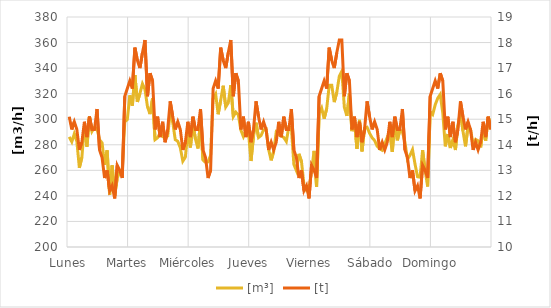
| Category | [m³] |
|---|---|
| Lunes | 286.2 |
| Lunes | 282.3 |
| Lunes | 288.6 |
| Lunes | 282.7 |
| Lunes | 262 |
| Lunes | 270.2 |
| Lunes | 294.7 |
| Lunes | 278.5 |
| Lunes | 302.2 |
| Lunes | 290.5 |
| Lunes | 293.8 |
| Lunes | 292.6 |
| Lunes | 283.9 |
| Lunes | 281.5 |
| Lunes | 264.4 |
| Lunes | 275.6 |
| Lunes | 241 |
| Lunes | 263.9 |
| Lunes | 240.3 |
| Lunes | 253.8 |
| Lunes | 258.5 |
| Lunes | 260.2 |
| Lunes | 298 |
| Lunes | 299.8 |
| Martes | 318.7 |
| Martes | 310.6 |
| Martes | 334.5 |
| Martes | 313.5 |
| Martes | 320.2 |
| Martes | 327.7 |
| Martes | 323.3 |
| Martes | 309.7 |
| Martes | 304 |
| Martes | 316.2 |
| Martes | 284 |
| Martes | 285.5 |
| Martes | 289.1 |
| Martes | 286.5 |
| Martes | 285.1 |
| Martes | 286.9 |
| Martes | 305.5 |
| Martes | 297.6 |
| Martes | 284 |
| Martes | 282.7 |
| Martes | 277.7 |
| Martes | 267.2 |
| Martes | 270.3 |
| Martes | 291.5 |
| Miércoles | 277.9 |
| Miércoles | 296.2 |
| Miércoles | 284.5 |
| Miércoles | 277.1 |
| Miércoles | 298.4 |
| Miércoles | 268.1 |
| Miércoles | 266.2 |
| Miércoles | 266.6 |
| Miércoles | 271.7 |
| Miércoles | 316.2 |
| Miércoles | 319.7 |
| Miércoles | 303.9 |
| Miércoles | 314.8 |
| Miércoles | 326.2 |
| Miércoles | 309.6 |
| Miércoles | 312.8 |
| Miércoles | 326.7 |
| Miércoles | 302.1 |
| Miércoles | 305.5 |
| Miércoles | 303.3 |
| Miércoles | 291.5 |
| Miércoles | 286.4 |
| Miércoles | 291.1 |
| Miércoles | 290.2 |
| Jueves | 267.3 |
| Jueves | 286.7 |
| Jueves | 297.3 |
| Jueves | 285.7 |
| Jueves | 287.3 |
| Jueves | 291.7 |
| Jueves | 292.3 |
| Jueves | 276.3 |
| Jueves | 267.8 |
| Jueves | 274.8 |
| Jueves | 289.8 |
| Jueves | 288 |
| Jueves | 286.9 |
| Jueves | 285.7 |
| Jueves | 282.6 |
| Jueves | 294 |
| Jueves | 293.5 |
| Jueves | 264.6 |
| Jueves | 259.8 |
| Jueves | 272.9 |
| Jueves | 267 |
| Jueves | 248.6 |
| Jueves | 244.3 |
| Jueves | 246 |
| Viernes | 259.2 |
| Viernes | 275.2 |
| Viernes | 247.1 |
| Viernes | 304.4 |
| Viernes | 308.7 |
| Viernes | 300.4 |
| Viernes | 308.3 |
| Viernes | 326.5 |
| Viernes | 326.6 |
| Viernes | 313.4 |
| Viernes | 321 |
| Viernes | 333.6 |
| Viernes | 337.5 |
| Viernes | 309.3 |
| Viernes | 302.6 |
| Viernes | 320 |
| Viernes | 290.7 |
| Viernes | 298.1 |
| Viernes | 276.8 |
| Viernes | 299.5 |
| Viernes | 274.8 |
| Viernes | 292.9 |
| Viernes | 293.7 |
| Viernes | 289 |
| Sábado | 285.5 |
| Sábado | 283.3 |
| Sábado | 278.9 |
| Sábado | 276.8 |
| Sábado | 275.7 |
| Sábado | 280.6 |
| Sábado | 285.8 |
| Sábado | 290.8 |
| Sábado | 274.4 |
| Sábado | 298.4 |
| Sábado | 283.5 |
| Sábado | 291.5 |
| Sábado | 290.2 |
| Sábado | 282 |
| Sábado | 268.8 |
| Sábado | 271.7 |
| Sábado | 276.2 |
| Sábado | 264.9 |
| Sábado | 255 |
| Sábado | 254.6 |
| Sábado | 275.8 |
| Sábado | 259.9 |
| Sábado | 247.4 |
| Sábado | 305.9 |
| Domingo | 303.7 |
| Domingo | 311.3 |
| Domingo | 316.4 |
| Domingo | 319.4 |
| Domingo | 304.8 |
| Domingo | 278.8 |
| Domingo | 288.4 |
| Domingo | 277.5 |
| Domingo | 283.8 |
| Domingo | 275.9 |
| Domingo | 295.2 |
| Domingo | 305.7 |
| Domingo | 290.7 |
| Domingo | 278.8 |
| Domingo | 294.6 |
| Domingo | 292 |
| Domingo | 280.2 |
| Domingo | 284.2 |
| Domingo | 283.2 |
| Domingo | 278 |
| Domingo | 292.7 |
| Domingo | 283.3 |
| Domingo | 301.8 |
| Domingo | 295.2 |